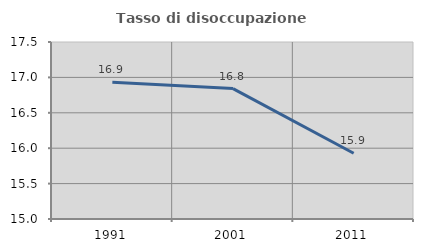
| Category | Tasso di disoccupazione giovanile  |
|---|---|
| 1991.0 | 16.932 |
| 2001.0 | 16.842 |
| 2011.0 | 15.929 |